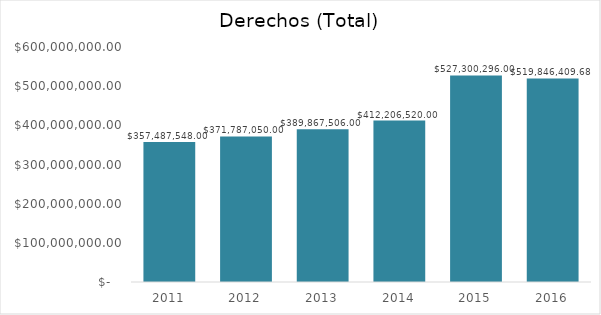
| Category | Derechos (total) |
|---|---|
| 2011.0 | 357487548 |
| 2012.0 | 371787050 |
| 2013.0 | 389867506 |
| 2014.0 | 412206520 |
| 2015.0 | 527300296 |
| 2016.0 | 519846409.68 |